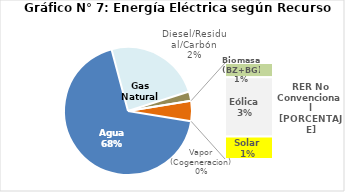
| Category | Series 0 |
|---|---|
| Agua | 3209.789 |
| Gas Natural | 1139.662 |
| Diesel/Residual/Carbón | 109.212 |
| Vapor (Cogeneracion) | 0.415 |
| Biomasa (BZ+BG) | 35.976 |
| Eólica | 149.654 |
| Solar | 57.145 |